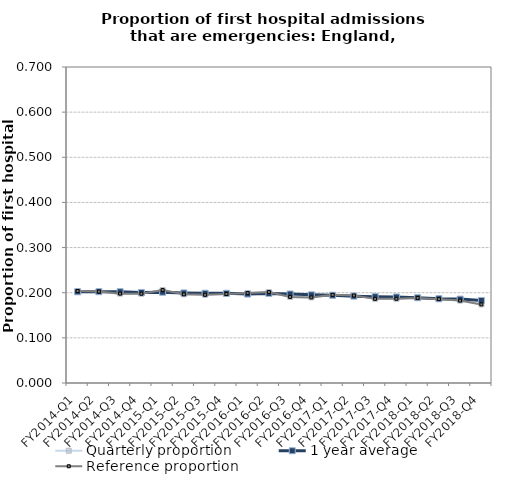
| Category | Quarterly proportion | 1 year average | Reference proportion |
|---|---|---|---|
| FY2014-Q1 | 0.204 | 0.202 | 0.204 |
| FY2014-Q2 | 0.203 | 0.202 | 0.203 |
| FY2014-Q3 | 0.198 | 0.202 | 0.198 |
| FY2014-Q4 | 0.198 | 0.201 | 0.198 |
| FY2015-Q1 | 0.206 | 0.201 | 0.206 |
| FY2015-Q2 | 0.196 | 0.2 | 0.196 |
| FY2015-Q3 | 0.195 | 0.199 | 0.195 |
| FY2015-Q4 | 0.197 | 0.199 | 0.197 |
| FY2016-Q1 | 0.199 | 0.197 | 0.199 |
| FY2016-Q2 | 0.201 | 0.198 | 0.201 |
| FY2016-Q3 | 0.191 | 0.197 | 0.191 |
| FY2016-Q4 | 0.19 | 0.195 | 0.19 |
| FY2017-Q1 | 0.195 | 0.194 | 0.195 |
| FY2017-Q2 | 0.194 | 0.192 | 0.194 |
| FY2017-Q3 | 0.186 | 0.191 | 0.186 |
| FY2017-Q4 | 0.187 | 0.191 | 0.187 |
| FY2018-Q1 | 0.188 | 0.189 | 0.188 |
| FY2018-Q2 | 0.186 | 0.187 | 0.186 |
| FY2018-Q3 | 0.183 | 0.186 | 0.183 |
| FY2018-Q4 | 0.174 | 0.183 | 0.174 |